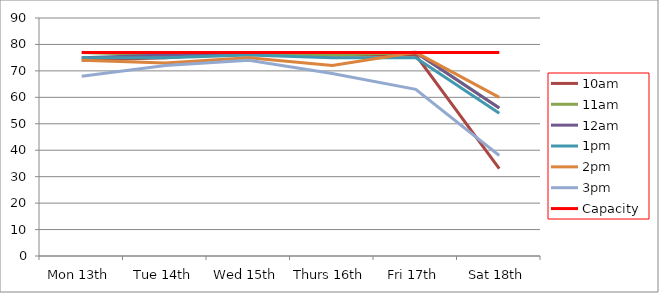
| Category | 9am | 10am | 11am | 12am | 1pm | 2pm | 3pm | 4pm | 5pm | Capacity |
|---|---|---|---|---|---|---|---|---|---|---|
| Mon 13th |  | 74 | 77 | 75 | 75 | 74 | 68 |  |  | 77 |
| Tue 14th |  | 75 | 76 | 76 | 75 | 73 | 72 |  |  | 77 |
| Wed 15th |  | 77 | 77 | 77 | 76 | 75 | 74 |  |  | 77 |
| Thurs 16th |  | 76 | 76 | 77 | 75 | 72 | 69 |  |  | 77 |
| Fri 17th |  | 76 | 77 | 77 | 75 | 77 | 63 |  |  | 77 |
| Sat 18th |  | 33 | 56 | 56 | 54 | 60 | 38 |  |  | 77 |